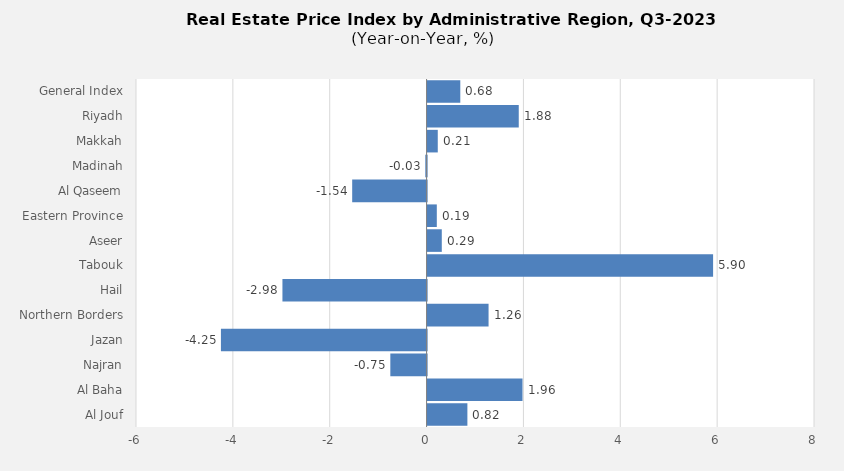
| Category | 2023 |
|---|---|
| General Index | 0.676 |
| Riyadh | 1.883 |
| Makkah | 0.211 |
| Madinah | -0.026 |
| Al Qaseem | -1.536 |
| Eastern Province | 0.191 |
| Aseer | 0.294 |
| Tabouk | 5.896 |
| Hail | -2.976 |
| Northern Borders | 1.26 |
| Jazan | -4.246 |
| Najran | -0.748 |
| Al Baha | 1.96 |
| Al Jouf | 0.822 |